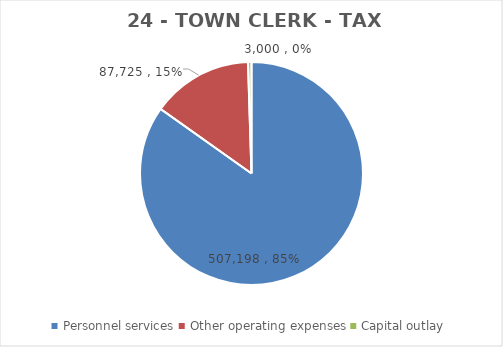
| Category | Series 0 | Series 1 | Series 2 | Series 3 | Series 4 | Series 5 | Series 6 |
|---|---|---|---|---|---|---|---|
| Personnel services | 507198 |  |  | 491743 | 559696 | 493976 | 507198 |
| Other operating expenses | 87725 |  |  | 72163 | 86120 | 87725 | 87725 |
| Capital outlay | 3000 |  |  | 1375 | 3000 | 3000 | 3000 |